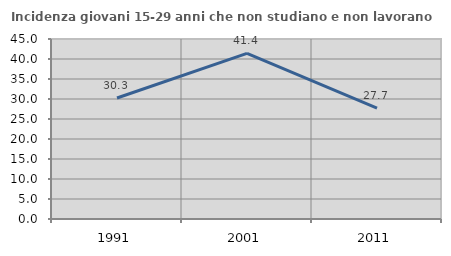
| Category | Incidenza giovani 15-29 anni che non studiano e non lavorano  |
|---|---|
| 1991.0 | 30.25 |
| 2001.0 | 41.404 |
| 2011.0 | 27.747 |